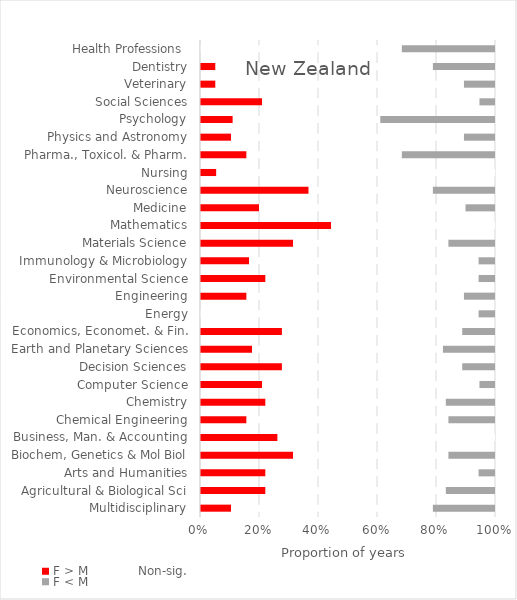
| Category | F > M | Non-sig. | F < M |
|---|---|---|---|
| Multidisciplinary | 2 | 13 | 4 |
| Agricultural & Biological Sci | 4 | 11 | 3 |
| Arts and Humanities | 4 | 13 | 1 |
| Biochem, Genetics & Mol Biol | 6 | 10 | 3 |
| Business, Man. & Accounting | 5 | 14 | 0 |
| Chemical Engineering | 3 | 13 | 3 |
| Chemistry | 4 | 11 | 3 |
| Computer Science | 4 | 14 | 1 |
| Decision Sciences | 5 | 11 | 2 |
| Earth and Planetary Sciences | 3 | 11 | 3 |
| Economics, Economet. & Fin. | 5 | 11 | 2 |
| Energy | 0 | 17 | 1 |
| Engineering | 3 | 14 | 2 |
| Environmental Science | 4 | 13 | 1 |
| Immunology & Microbiology | 3 | 14 | 1 |
| Materials Science | 6 | 10 | 3 |
| Mathematics | 8 | 10 | 0 |
| Medicine | 2 | 7 | 1 |
| Neuroscience | 7 | 8 | 4 |
| Nursing | 1 | 17 | 0 |
| Pharma., Toxicol. & Pharm. | 3 | 10 | 6 |
| Physics and Astronomy | 2 | 15 | 2 |
| Psychology | 2 | 9 | 7 |
| Social Sciences | 4 | 14 | 1 |
| Veterinary | 1 | 16 | 2 |
| Dentistry | 1 | 14 | 4 |
| Health Professions  | 0 | 13 | 6 |